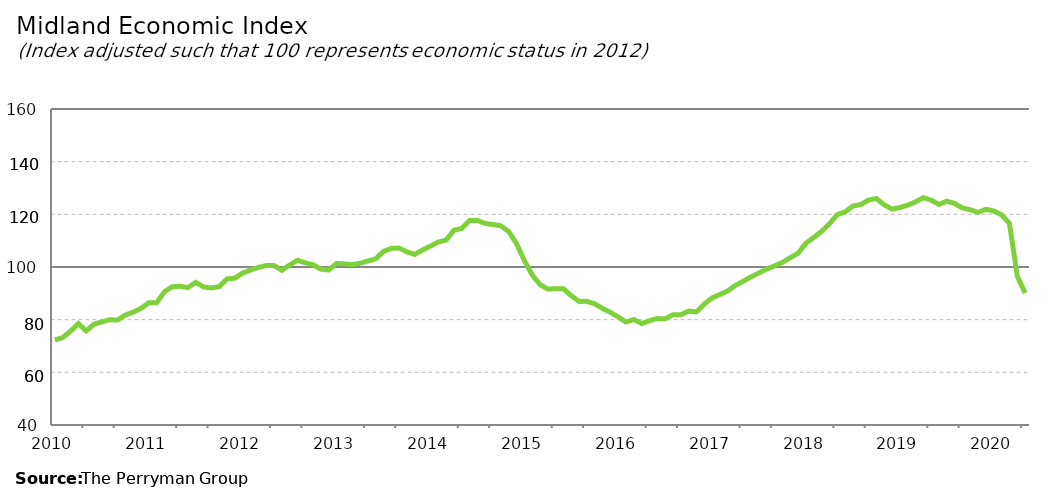
| Category | Midland Composite |
|---|---|
| 2010-01-31 | 72.31 |
| 2010-02-28 | 73.192 |
| 2010-03-31 | 75.644 |
| 2010-04-30 | 78.482 |
| 2010-05-31 | 75.718 |
| 2010-06-30 | 78.3 |
| 2010-07-31 | 79.15 |
| 2010-08-31 | 79.974 |
| 2010-09-30 | 79.87 |
| 2010-10-31 | 81.782 |
| 2010-11-30 | 82.851 |
| 2010-12-31 | 84.311 |
| 2011-01-31 | 86.417 |
| 2011-02-28 | 86.409 |
| 2011-03-31 | 90.604 |
| 2011-04-30 | 92.512 |
| 2011-05-31 | 92.709 |
| 2011-06-30 | 92.154 |
| 2011-07-31 | 94.181 |
| 2011-08-31 | 92.419 |
| 2011-09-30 | 92.047 |
| 2011-10-31 | 92.547 |
| 2011-11-30 | 95.511 |
| 2011-12-31 | 95.754 |
| 2012-01-31 | 97.706 |
| 2012-02-29 | 98.848 |
| 2012-03-31 | 99.827 |
| 2012-04-30 | 100.558 |
| 2012-05-31 | 100.549 |
| 2012-06-30 | 98.754 |
| 2012-07-31 | 100.754 |
| 2012-08-31 | 102.577 |
| 2012-09-30 | 101.582 |
| 2012-10-31 | 100.854 |
| 2012-11-30 | 99.174 |
| 2012-12-31 | 98.86 |
| 2013-01-31 | 101.323 |
| 2013-02-28 | 101.183 |
| 2013-03-31 | 100.902 |
| 2013-04-30 | 101.396 |
| 2013-05-31 | 102.279 |
| 2013-06-30 | 103.098 |
| 2013-07-31 | 105.919 |
| 2013-08-31 | 107.097 |
| 2013-09-30 | 107.201 |
| 2013-10-31 | 105.723 |
| 2013-11-30 | 104.77 |
| 2013-12-31 | 106.484 |
| 2014-01-31 | 107.933 |
| 2014-02-28 | 109.475 |
| 2014-03-31 | 110.22 |
| 2014-04-30 | 113.967 |
| 2014-05-31 | 114.637 |
| 2014-06-30 | 117.631 |
| 2014-07-31 | 117.701 |
| 2014-08-31 | 116.505 |
| 2014-09-30 | 116.152 |
| 2014-10-31 | 115.631 |
| 2014-11-30 | 113.453 |
| 2014-12-31 | 108.851 |
| 2015-01-31 | 102.457 |
| 2015-02-28 | 97.037 |
| 2015-03-31 | 93.3 |
| 2015-04-30 | 91.636 |
| 2015-05-31 | 91.753 |
| 2015-06-30 | 91.729 |
| 2015-07-31 | 89.094 |
| 2015-08-31 | 86.941 |
| 2015-09-30 | 86.952 |
| 2015-10-31 | 86.001 |
| 2015-11-30 | 84.261 |
| 2015-12-31 | 82.761 |
| 2016-01-31 | 80.99 |
| 2016-02-29 | 79.131 |
| 2016-03-31 | 80.053 |
| 2016-04-30 | 78.518 |
| 2016-05-31 | 79.595 |
| 2016-06-30 | 80.456 |
| 2016-07-31 | 80.273 |
| 2016-08-31 | 81.899 |
| 2016-09-30 | 81.843 |
| 2016-10-31 | 83.275 |
| 2016-11-30 | 82.942 |
| 2016-12-31 | 85.945 |
| 2017-01-31 | 88.27 |
| 2017-02-28 | 89.579 |
| 2017-03-31 | 90.917 |
| 2017-04-30 | 93.059 |
| 2017-05-31 | 94.633 |
| 2017-06-30 | 96.3 |
| 2017-07-31 | 97.778 |
| 2017-08-31 | 99.224 |
| 2017-09-30 | 100.465 |
| 2017-10-31 | 101.778 |
| 2017-11-30 | 103.55 |
| 2017-12-31 | 105.241 |
| 2018-01-31 | 109.073 |
| 2018-02-28 | 111.21 |
| 2018-03-31 | 113.542 |
| 2018-04-30 | 116.462 |
| 2018-05-31 | 119.885 |
| 2018-06-30 | 120.906 |
| 2018-07-31 | 123.196 |
| 2018-08-31 | 123.67 |
| 2018-09-30 | 125.455 |
| 2018-10-31 | 125.99 |
| 2018-11-30 | 123.585 |
| 2018-12-31 | 121.972 |
| 2019-01-31 | 122.634 |
| 2019-02-28 | 123.47 |
| 2019-03-31 | 124.752 |
| 2019-04-30 | 126.316 |
| 2019-05-31 | 125.364 |
| 2019-06-30 | 123.74 |
| 2019-07-31 | 125.006 |
| 2019-08-31 | 124.117 |
| 2019-09-30 | 122.383 |
| 2019-10-31 | 121.732 |
| 2019-11-30 | 120.748 |
| 2019-12-31 | 121.932 |
| 2020-01-31 | 121.234 |
| 2020-02-29 | 119.786 |
| 2020-03-31 | 116.536 |
| 2020-04-30 | 96.507 |
| 2020-05-31 | 90.135 |